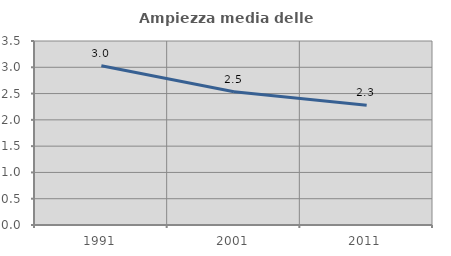
| Category | Ampiezza media delle famiglie |
|---|---|
| 1991.0 | 3.03 |
| 2001.0 | 2.534 |
| 2011.0 | 2.28 |